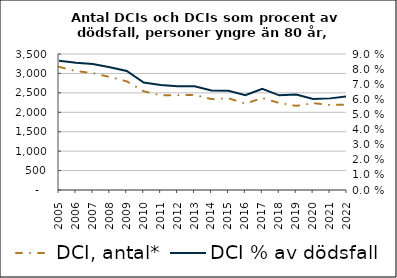
| Category | DCI, antal* |
|---|---|
| 2005.0 | 3169 |
| 2006.0 | 3062 |
| 2007.0 | 3008 |
| 2008.0 | 2909 |
| 2009.0 | 2796 |
| 2010.0 | 2541 |
| 2011.0 | 2437 |
| 2012.0 | 2440 |
| 2013.0 | 2448 |
| 2014.0 | 2339 |
| 2015.0 | 2360 |
| 2016.0 | 2224 |
| 2017.0 | 2367 |
| 2018.0 | 2239 |
| 2019.0 | 2165 |
| 2020.0 | 2236 |
| 2021.0 | 2188 |
| 2022.0 | 2197 |